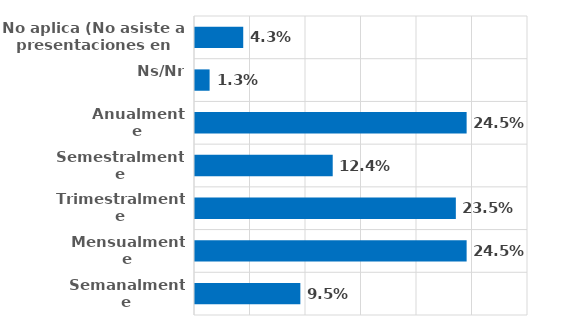
| Category | Series 0 |
|---|---|
| Semanalmente | 0.095 |
| Mensualmente | 0.245 |
| Trimestralmente | 0.235 |
| Semestralmente | 0.124 |
| Anualmente | 0.245 |
| Ns/Nr | 0.013 |
| No aplica (No asiste a presentaciones en vivo) | 0.043 |